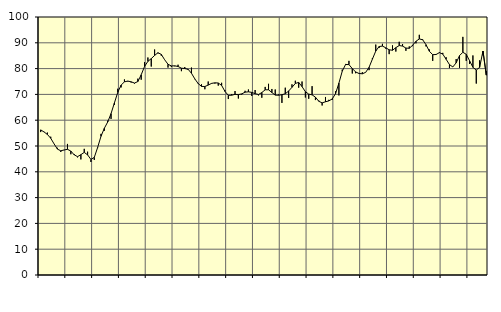
| Category | Piggar | Series 1 |
|---|---|---|
| nan | 55.4 | 56.25 |
| 87.0 | 55.5 | 55.45 |
| 87.0 | 55.2 | 54.48 |
| 87.0 | 53.6 | 53 |
| nan | 50.8 | 50.82 |
| 88.0 | 49.3 | 48.79 |
| 88.0 | 47.7 | 48.13 |
| 88.0 | 48.4 | 48.47 |
| nan | 50.8 | 48.72 |
| 89.0 | 46.8 | 48.03 |
| 89.0 | 46.9 | 46.59 |
| 89.0 | 45.6 | 45.87 |
| nan | 44.8 | 46.64 |
| 90.0 | 48.9 | 47.52 |
| 90.0 | 47.8 | 46.57 |
| 90.0 | 43.8 | 44.8 |
| nan | 44.6 | 45.58 |
| 91.0 | 49.2 | 49.44 |
| 91.0 | 54.7 | 53.76 |
| 91.0 | 55.9 | 56.87 |
| nan | 59.8 | 59.3 |
| 92.0 | 60.5 | 62.55 |
| 92.0 | 65.9 | 66.69 |
| 92.0 | 72.2 | 70.76 |
| nan | 72.7 | 73.61 |
| 93.0 | 75.8 | 74.86 |
| 93.0 | 75 | 75.17 |
| 93.0 | 74.6 | 74.88 |
| nan | 74.2 | 74.39 |
| 94.0 | 76.1 | 74.98 |
| 94.0 | 75.7 | 77.6 |
| 94.0 | 82.5 | 80.82 |
| nan | 84.3 | 82.81 |
| 95.0 | 80.8 | 83.87 |
| 95.0 | 87.4 | 85.09 |
| 95.0 | 85.9 | 86.15 |
| nan | 85 | 85.51 |
| 96.0 | 83.4 | 83.43 |
| 96.0 | 80.4 | 81.68 |
| 96.0 | 80.6 | 81.03 |
| nan | 80.9 | 81.08 |
| 97.0 | 81.5 | 80.82 |
| 97.0 | 79 | 80.17 |
| 97.0 | 80.6 | 80.03 |
| nan | 79.5 | 79.73 |
| 98.0 | 80.4 | 78.2 |
| 98.0 | 75.9 | 76.02 |
| 98.0 | 74.4 | 74.2 |
| nan | 73.9 | 73.1 |
| 99.0 | 72 | 73.06 |
| 99.0 | 75 | 73.61 |
| 99.0 | 74.4 | 74.27 |
| nan | 74.2 | 74.49 |
| 0.0 | 73.4 | 74.42 |
| 0.0 | 74.5 | 73.49 |
| 0.0 | 71.6 | 71.17 |
| nan | 68.2 | 69.64 |
| 1.0 | 70.1 | 69.68 |
| 1.0 | 71.3 | 70.01 |
| 1.0 | 68.4 | 69.91 |
| nan | 69.9 | 70.2 |
| 2.0 | 71.4 | 70.86 |
| 2.0 | 71.9 | 71 |
| 2.0 | 69.4 | 70.78 |
| nan | 71.7 | 70.28 |
| 3.0 | 69.6 | 69.96 |
| 3.0 | 68.7 | 70.72 |
| 3.0 | 72.9 | 71.78 |
| nan | 74.1 | 71.79 |
| 4.0 | 72.1 | 70.73 |
| 4.0 | 71.9 | 69.72 |
| 4.0 | 70 | 69.68 |
| nan | 66.7 | 69.89 |
| 5.0 | 72.6 | 70.22 |
| 5.0 | 68.6 | 71.31 |
| 5.0 | 73.9 | 72.74 |
| nan | 75.3 | 74.24 |
| 6.0 | 72.6 | 74.65 |
| 6.0 | 75 | 73.01 |
| 6.0 | 68.8 | 71.06 |
| nan | 68.3 | 70.11 |
| 7.0 | 73.2 | 69.82 |
| 7.0 | 67.8 | 68.94 |
| 7.0 | 67.6 | 67.33 |
| nan | 65.7 | 66.72 |
| 8.0 | 69 | 67.14 |
| 8.0 | 67.9 | 67.48 |
| 8.0 | 67.9 | 68.23 |
| nan | 71.2 | 70.26 |
| 9.0 | 69.6 | 74.36 |
| 9.0 | 79.6 | 78.98 |
| 9.0 | 81.8 | 81.6 |
| nan | 83 | 81.55 |
| 10.0 | 78.1 | 80.02 |
| 10.0 | 78.2 | 78.7 |
| 10.0 | 78 | 78.12 |
| nan | 78.6 | 77.98 |
| 11.0 | 78.6 | 78.56 |
| 11.0 | 79.4 | 80.49 |
| 11.0 | 84.1 | 83.67 |
| nan | 89.3 | 86.79 |
| 12.0 | 88 | 88.56 |
| 12.0 | 89.6 | 88.72 |
| 12.0 | 87.7 | 88.06 |
| nan | 85.6 | 87.29 |
| 13.0 | 89 | 87.11 |
| 13.0 | 86.6 | 88.12 |
| 13.0 | 90.4 | 88.94 |
| nan | 89.5 | 88.72 |
| 14.0 | 86.9 | 87.97 |
| 14.0 | 88.6 | 87.86 |
| 14.0 | 88.7 | 89.04 |
| nan | 89.8 | 90.58 |
| 15.0 | 93.1 | 91.5 |
| 15.0 | 91.4 | 91.18 |
| 15.0 | 88.6 | 89.26 |
| nan | 87.4 | 86.72 |
| 16.0 | 83 | 85.39 |
| 16.0 | 85.6 | 85.47 |
| 16.0 | 86.4 | 86.18 |
| nan | 86.1 | 85.63 |
| 17.0 | 84.4 | 83.61 |
| 17.0 | 80.2 | 81.56 |
| 17.0 | 80.7 | 80.64 |
| nan | 83.7 | 82.23 |
| 18.0 | 80.3 | 85.03 |
| 18.0 | 92.3 | 86.33 |
| 18.0 | 83 | 85.55 |
| nan | 81.8 | 83.06 |
| 19.0 | 85.1 | 80.49 |
| 19.0 | 74.2 | 79.44 |
| 19.0 | 83.2 | 80.47 |
| nan | 85.1 | 86.81 |
| 20.0 | 79 | 77.47 |